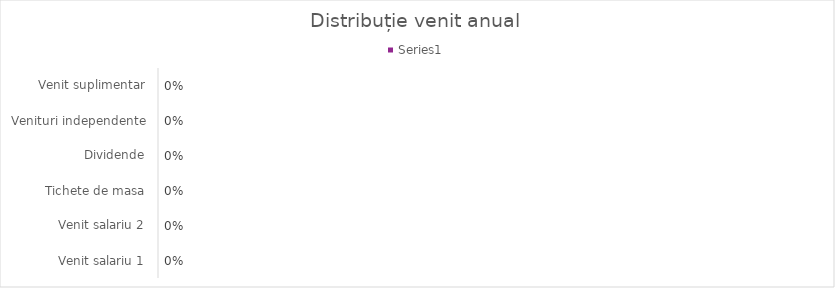
| Category | Series 0 |
|---|---|
| Venit salariu 1 | 0 |
| Venit salariu 2 | 0 |
| Tichete de masa | 0 |
| Dividende | 0 |
| Venituri independente | 0 |
| Venit suplimentar | 0 |